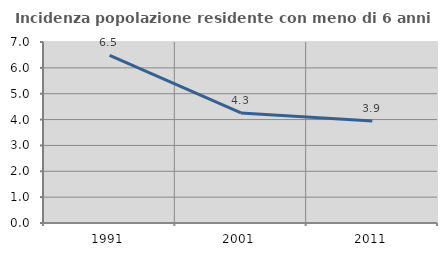
| Category | Incidenza popolazione residente con meno di 6 anni |
|---|---|
| 1991.0 | 6.483 |
| 2001.0 | 4.257 |
| 2011.0 | 3.944 |